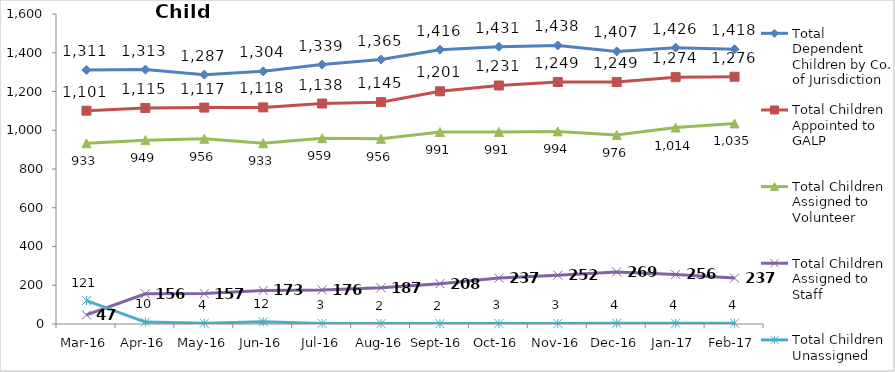
| Category | Total Dependent Children by Co. of Jurisdiction | Total Children Appointed to GALP | Total Children Assigned to Volunteer | Total Children Assigned to Staff | Total Children Unassigned |
|---|---|---|---|---|---|
| Mar-16 | 1311 | 1101 | 933 | 47 | 121 |
| Apr-16 | 1313 | 1115 | 949 | 156 | 10 |
| May-16 | 1287 | 1117 | 956 | 157 | 4 |
| Jun-16 | 1304 | 1118 | 933 | 173 | 12 |
| Jul-16 | 1339 | 1138 | 959 | 176 | 3 |
| Aug-16 | 1365 | 1145 | 956 | 187 | 2 |
| Sep-16 | 1416 | 1201 | 991 | 208 | 2 |
| Oct-16 | 1431 | 1231 | 991 | 237 | 3 |
| Nov-16 | 1438 | 1249 | 994 | 252 | 3 |
| Dec-16 | 1407 | 1249 | 976 | 269 | 4 |
| Jan-17 | 1426 | 1274 | 1014 | 256 | 4 |
| Feb-17 | 1418 | 1276 | 1035 | 237 | 4 |